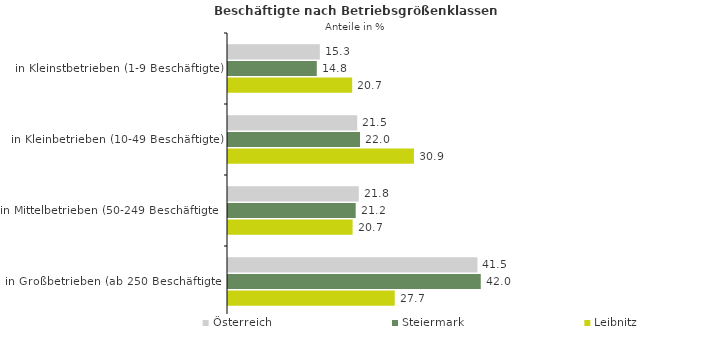
| Category | Österreich | Steiermark | Leibnitz |
|---|---|---|---|
| in Kleinstbetrieben (1-9 Beschäftigte) | 15.273 | 14.768 | 20.656 |
| in Kleinbetrieben (10-49 Beschäftigte) | 21.487 | 21.955 | 30.925 |
| in Mittelbetrieben (50-249 Beschäftigte) | 21.75 | 21.237 | 20.723 |
| in Großbetrieben (ab 250 Beschäftigte) | 41.489 | 42.04 | 27.729 |